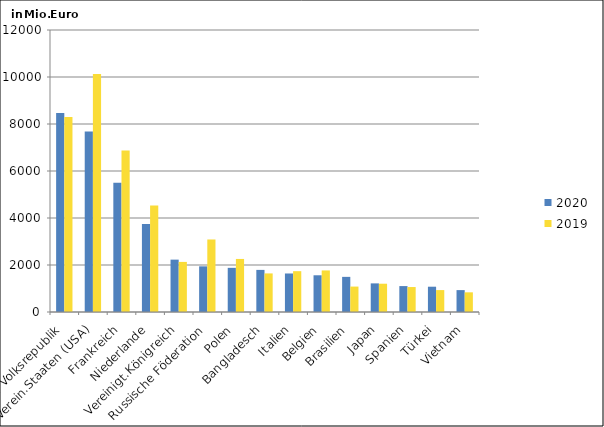
| Category | 2020 | 2019 |
|---|---|---|
| China, Volksrepublik | 8463.557 | 8292.665 |
| Verein.Staaten (USA) | 7675.567 | 10128.894 |
| Frankreich | 5498.773 | 6873.294 |
| Niederlande | 3747.064 | 4536.795 |
| Vereinigt.Königreich | 2228.326 | 2131.575 |
| Russische Föderation | 1942.926 | 3086.041 |
| Polen | 1879.172 | 2257.366 |
| Bangladesch | 1791.502 | 1641.774 |
| Italien | 1639.144 | 1737.419 |
| Belgien | 1562.628 | 1768.724 |
| Brasilien | 1494.919 | 1081.851 |
| Japan | 1217.843 | 1203.599 |
| Spanien | 1102.887 | 1062.427 |
| Türkei | 1076.306 | 932.614 |
| Vietnam | 931.675 | 837.144 |